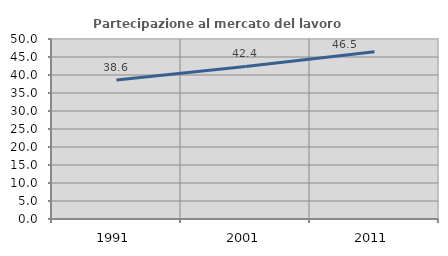
| Category | Partecipazione al mercato del lavoro  femminile |
|---|---|
| 1991.0 | 38.601 |
| 2001.0 | 42.383 |
| 2011.0 | 46.466 |